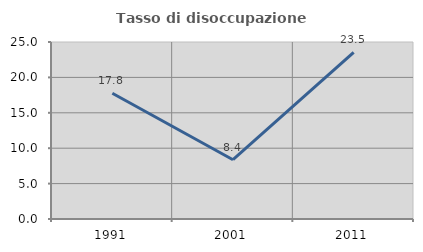
| Category | Tasso di disoccupazione giovanile  |
|---|---|
| 1991.0 | 17.763 |
| 2001.0 | 8.374 |
| 2011.0 | 23.529 |